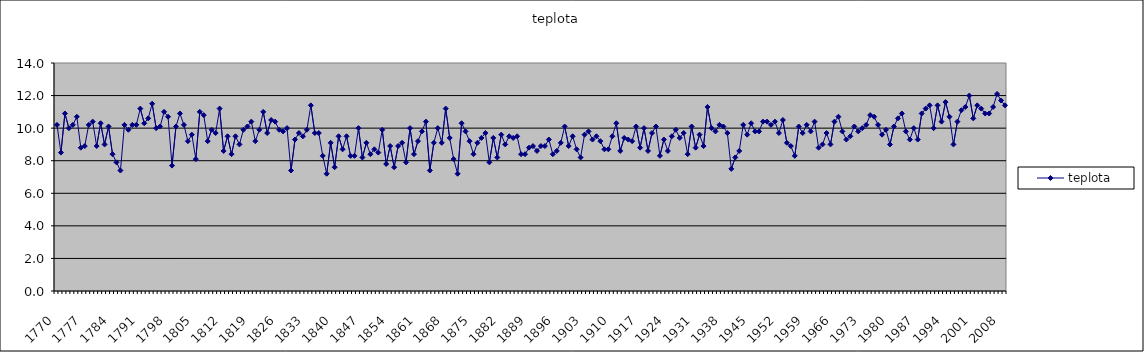
| Category | teplota |
|---|---|
| 1770.0 | 10.2 |
| 1771.0 | 8.5 |
| 1772.0 | 10.9 |
| 1773.0 | 10 |
| 1774.0 | 10.2 |
| 1775.0 | 10.7 |
| 1776.0 | 8.8 |
| 1777.0 | 8.9 |
| 1778.0 | 10.2 |
| 1779.0 | 10.4 |
| 1780.0 | 8.9 |
| 1781.0 | 10.3 |
| 1782.0 | 9 |
| 1783.0 | 10.1 |
| 1784.0 | 8.4 |
| 1785.0 | 7.9 |
| 1786.0 | 7.4 |
| 1787.0 | 10.2 |
| 1788.0 | 9.9 |
| 1789.0 | 10.2 |
| 1790.0 | 10.2 |
| 1791.0 | 11.2 |
| 1792.0 | 10.3 |
| 1793.0 | 10.6 |
| 1794.0 | 11.5 |
| 1795.0 | 10 |
| 1796.0 | 10.1 |
| 1797.0 | 11 |
| 1798.0 | 10.7 |
| 1799.0 | 7.7 |
| 1800.0 | 10.1 |
| 1801.0 | 10.9 |
| 1802.0 | 10.2 |
| 1803.0 | 9.2 |
| 1804.0 | 9.6 |
| 1805.0 | 8.1 |
| 1806.0 | 11 |
| 1807.0 | 10.8 |
| 1808.0 | 9.2 |
| 1809.0 | 9.9 |
| 1810.0 | 9.7 |
| 1811.0 | 11.2 |
| 1812.0 | 8.6 |
| 1813.0 | 9.5 |
| 1814.0 | 8.4 |
| 1815.0 | 9.5 |
| 1816.0 | 9 |
| 1817.0 | 9.9 |
| 1818.0 | 10.1 |
| 1819.0 | 10.4 |
| 1820.0 | 9.2 |
| 1821.0 | 9.9 |
| 1822.0 | 11 |
| 1823.0 | 9.7 |
| 1824.0 | 10.5 |
| 1825.0 | 10.4 |
| 1826.0 | 9.9 |
| 1827.0 | 9.8 |
| 1828.0 | 10 |
| 1829.0 | 7.4 |
| 1830.0 | 9.3 |
| 1831.0 | 9.7 |
| 1832.0 | 9.5 |
| 1833.0 | 9.9 |
| 1834.0 | 11.4 |
| 1835.0 | 9.7 |
| 1836.0 | 9.7 |
| 1837.0 | 8.3 |
| 1838.0 | 7.2 |
| 1839.0 | 9.1 |
| 1840.0 | 7.6 |
| 1841.0 | 9.5 |
| 1842.0 | 8.7 |
| 1843.0 | 9.5 |
| 1844.0 | 8.3 |
| 1845.0 | 8.3 |
| 1846.0 | 10 |
| 1847.0 | 8.2 |
| 1848.0 | 9.1 |
| 1849.0 | 8.4 |
| 1850.0 | 8.7 |
| 1851.0 | 8.5 |
| 1852.0 | 9.9 |
| 1853.0 | 7.8 |
| 1854.0 | 8.9 |
| 1855.0 | 7.6 |
| 1856.0 | 8.9 |
| 1857.0 | 9.1 |
| 1858.0 | 7.9 |
| 1859.0 | 10 |
| 1860.0 | 8.4 |
| 1861.0 | 9.2 |
| 1862.0 | 9.8 |
| 1863.0 | 10.4 |
| 1864.0 | 7.4 |
| 1865.0 | 9.1 |
| 1866.0 | 10 |
| 1867.0 | 9.1 |
| 1868.0 | 11.2 |
| 1869.0 | 9.4 |
| 1870.0 | 8.1 |
| 1871.0 | 7.2 |
| 1872.0 | 10.3 |
| 1873.0 | 9.8 |
| 1874.0 | 9.2 |
| 1875.0 | 8.4 |
| 1876.0 | 9.1 |
| 1877.0 | 9.4 |
| 1878.0 | 9.7 |
| 1879.0 | 7.9 |
| 1880.0 | 9.4 |
| 1881.0 | 8.2 |
| 1882.0 | 9.6 |
| 1883.0 | 9 |
| 1884.0 | 9.5 |
| 1885.0 | 9.4 |
| 1886.0 | 9.5 |
| 1887.0 | 8.4 |
| 1888.0 | 8.4 |
| 1889.0 | 8.8 |
| 1890.0 | 8.9 |
| 1891.0 | 8.6 |
| 1892.0 | 8.9 |
| 1893.0 | 8.9 |
| 1894.0 | 9.3 |
| 1895.0 | 8.4 |
| 1896.0 | 8.6 |
| 1897.0 | 9.1 |
| 1898.0 | 10.1 |
| 1899.0 | 8.9 |
| 1900.0 | 9.5 |
| 1901.0 | 8.7 |
| 1902.0 | 8.2 |
| 1903.0 | 9.6 |
| 1904.0 | 9.8 |
| 1905.0 | 9.3 |
| 1906.0 | 9.5 |
| 1907.0 | 9.2 |
| 1908.0 | 8.7 |
| 1909.0 | 8.7 |
| 1910.0 | 9.5 |
| 1911.0 | 10.3 |
| 1912.0 | 8.6 |
| 1913.0 | 9.4 |
| 1914.0 | 9.3 |
| 1915.0 | 9.2 |
| 1916.0 | 10.1 |
| 1917.0 | 8.8 |
| 1918.0 | 10 |
| 1919.0 | 8.6 |
| 1920.0 | 9.7 |
| 1921.0 | 10.1 |
| 1922.0 | 8.3 |
| 1923.0 | 9.3 |
| 1924.0 | 8.6 |
| 1925.0 | 9.5 |
| 1926.0 | 9.9 |
| 1927.0 | 9.4 |
| 1928.0 | 9.7 |
| 1929.0 | 8.4 |
| 1930.0 | 10.1 |
| 1931.0 | 8.8 |
| 1932.0 | 9.6 |
| 1933.0 | 8.9 |
| 1934.0 | 11.3 |
| 1935.0 | 10 |
| 1936.0 | 9.8 |
| 1937.0 | 10.2 |
| 1938.0 | 10.1 |
| 1939.0 | 9.7 |
| 1940.0 | 7.5 |
| 1941.0 | 8.2 |
| 1942.0 | 8.6 |
| 1943.0 | 10.2 |
| 1944.0 | 9.6 |
| 1945.0 | 10.3 |
| 1946.0 | 9.8 |
| 1947.0 | 9.8 |
| 1948.0 | 10.4 |
| 1949.0 | 10.4 |
| 1950.0 | 10.2 |
| 1951.0 | 10.4 |
| 1952.0 | 9.7 |
| 1953.0 | 10.5 |
| 1954.0 | 9.1 |
| 1955.0 | 8.9 |
| 1956.0 | 8.3 |
| 1957.0 | 10.1 |
| 1958.0 | 9.7 |
| 1959.0 | 10.2 |
| 1960.0 | 9.8 |
| 1961.0 | 10.4 |
| 1962.0 | 8.8 |
| 1963.0 | 9 |
| 1964.0 | 9.7 |
| 1965.0 | 9 |
| 1966.0 | 10.4 |
| 1967.0 | 10.7 |
| 1968.0 | 9.8 |
| 1969.0 | 9.3 |
| 1970.0 | 9.5 |
| 1971.0 | 10.1 |
| 1972.0 | 9.8 |
| 1973.0 | 10 |
| 1974.0 | 10.2 |
| 1975.0 | 10.8 |
| 1976.0 | 10.7 |
| 1977.0 | 10.2 |
| 1978.0 | 9.6 |
| 1979.0 | 9.9 |
| 1980.0 | 9 |
| 1981.0 | 10.1 |
| 1982.0 | 10.6 |
| 1983.0 | 10.9 |
| 1984.0 | 9.8 |
| 1985.0 | 9.3 |
| 1986.0 | 10 |
| 1987.0 | 9.3 |
| 1988.0 | 10.9 |
| 1989.0 | 11.2 |
| 1990.0 | 11.4 |
| 1991.0 | 10 |
| 1992.0 | 11.4 |
| 1993.0 | 10.4 |
| 1994.0 | 11.6 |
| 1995.0 | 10.7 |
| 1996.0 | 9 |
| 1997.0 | 10.4 |
| 1998.0 | 11.1 |
| 1999.0 | 11.3 |
| 2000.0 | 12 |
| 2001.0 | 10.6 |
| 2002.0 | 11.4 |
| 2003.0 | 11.2 |
| 2004.0 | 10.9 |
| 2005.0 | 10.9 |
| 2006.0 | 11.3 |
| 2007.0 | 12.1 |
| 2008.0 | 11.7 |
| 2009.0 | 11.4 |